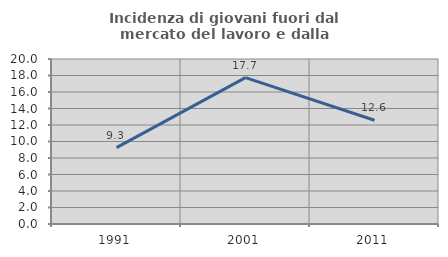
| Category | Incidenza di giovani fuori dal mercato del lavoro e dalla formazione  |
|---|---|
| 1991.0 | 9.254 |
| 2001.0 | 17.742 |
| 2011.0 | 12.577 |